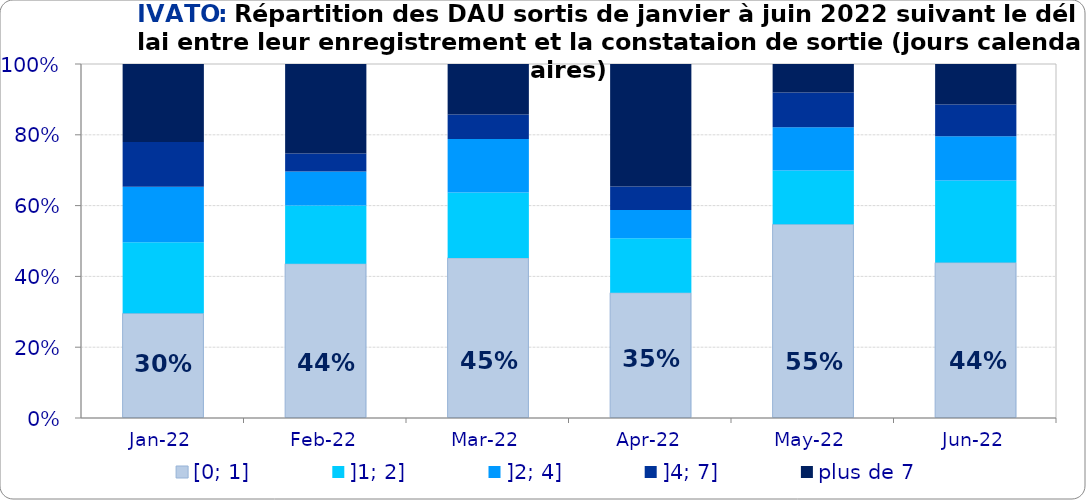
| Category | [0; 1] | ]1; 2] | ]2; 4] | ]4; 7] | plus de 7 |
|---|---|---|---|---|---|
| 2022-01-01 | 0.296 | 0.201 | 0.157 | 0.127 | 0.22 |
| 2022-02-01 | 0.436 | 0.164 | 0.096 | 0.051 | 0.253 |
| 2022-03-01 | 0.452 | 0.185 | 0.151 | 0.069 | 0.143 |
| 2022-04-01 | 0.354 | 0.154 | 0.08 | 0.066 | 0.346 |
| 2022-05-01 | 0.547 | 0.152 | 0.122 | 0.098 | 0.08 |
| 2022-06-01 | 0.439 | 0.232 | 0.125 | 0.09 | 0.114 |